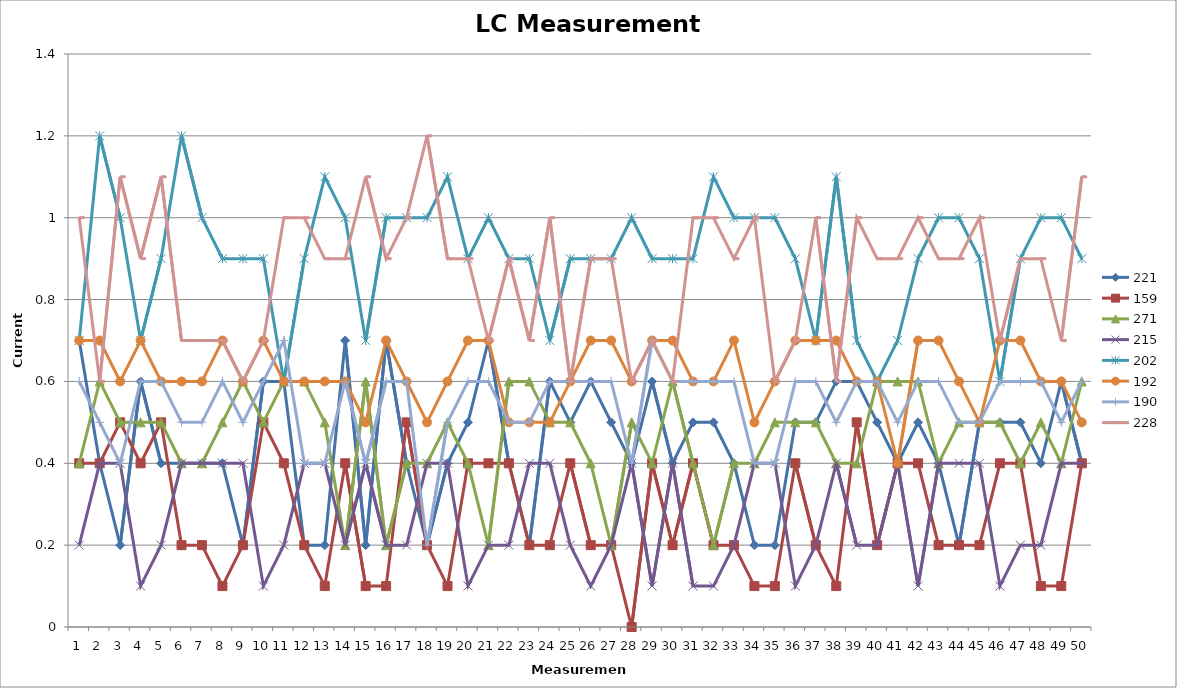
| Category | 221 | 159 | 271 | 215 | 202 | 192 | 190 | 228 |
|---|---|---|---|---|---|---|---|---|
| 0 | 0.7 | 0.4 | 0.4 | 0.2 | 0.7 | 0.7 | 0.6 | 1 |
| 1 | 0.4 | 0.4 | 0.6 | 0.4 | 1.2 | 0.7 | 0.5 | 0.6 |
| 2 | 0.2 | 0.5 | 0.5 | 0.4 | 1 | 0.6 | 0.4 | 1.1 |
| 3 | 0.6 | 0.4 | 0.5 | 0.1 | 0.7 | 0.7 | 0.6 | 0.9 |
| 4 | 0.4 | 0.5 | 0.5 | 0.2 | 0.9 | 0.6 | 0.6 | 1.1 |
| 5 | 0.4 | 0.2 | 0.4 | 0.4 | 1.2 | 0.6 | 0.5 | 0.7 |
| 6 | 0.4 | 0.2 | 0.4 | 0.4 | 1 | 0.6 | 0.5 | 0.7 |
| 7 | 0.4 | 0.1 | 0.5 | 0.4 | 0.9 | 0.7 | 0.6 | 0.7 |
| 8 | 0.2 | 0.2 | 0.6 | 0.4 | 0.9 | 0.6 | 0.5 | 0.6 |
| 9 | 0.6 | 0.5 | 0.5 | 0.1 | 0.9 | 0.7 | 0.6 | 0.7 |
| 10 | 0.6 | 0.4 | 0.6 | 0.2 | 0.6 | 0.6 | 0.7 | 1 |
| 11 | 0.2 | 0.2 | 0.6 | 0.4 | 0.9 | 0.6 | 0.4 | 1 |
| 12 | 0.2 | 0.1 | 0.5 | 0.4 | 1.1 | 0.6 | 0.4 | 0.9 |
| 13 | 0.7 | 0.4 | 0.2 | 0.2 | 1 | 0.6 | 0.6 | 0.9 |
| 14 | 0.2 | 0.1 | 0.6 | 0.4 | 0.7 | 0.5 | 0.4 | 1.1 |
| 15 | 0.7 | 0.1 | 0.2 | 0.2 | 1 | 0.7 | 0.6 | 0.9 |
| 16 | 0.4 | 0.5 | 0.4 | 0.2 | 1 | 0.6 | 0.6 | 1 |
| 17 | 0.2 | 0.2 | 0.4 | 0.4 | 1 | 0.5 | 0.2 | 1.2 |
| 18 | 0.4 | 0.1 | 0.5 | 0.4 | 1.1 | 0.6 | 0.5 | 0.9 |
| 19 | 0.5 | 0.4 | 0.4 | 0.1 | 0.9 | 0.7 | 0.6 | 0.9 |
| 20 | 0.7 | 0.4 | 0.2 | 0.2 | 1 | 0.7 | 0.6 | 0.7 |
| 21 | 0.4 | 0.4 | 0.6 | 0.2 | 0.9 | 0.5 | 0.5 | 0.9 |
| 22 | 0.2 | 0.2 | 0.6 | 0.4 | 0.9 | 0.5 | 0.5 | 0.7 |
| 23 | 0.6 | 0.2 | 0.5 | 0.4 | 0.7 | 0.5 | 0.6 | 1 |
| 24 | 0.5 | 0.4 | 0.5 | 0.2 | 0.9 | 0.6 | 0.6 | 0.6 |
| 25 | 0.6 | 0.2 | 0.4 | 0.1 | 0.9 | 0.7 | 0.6 | 0.9 |
| 26 | 0.5 | 0.2 | 0.2 | 0.2 | 0.9 | 0.7 | 0.6 | 0.9 |
| 27 | 0.4 | 0 | 0.5 | 0.4 | 1 | 0.6 | 0.4 | 0.6 |
| 28 | 0.6 | 0.4 | 0.4 | 0.1 | 0.9 | 0.7 | 0.7 | 0.7 |
| 29 | 0.4 | 0.2 | 0.6 | 0.4 | 0.9 | 0.7 | 0.6 | 0.6 |
| 30 | 0.5 | 0.4 | 0.4 | 0.1 | 0.9 | 0.6 | 0.6 | 1 |
| 31 | 0.5 | 0.2 | 0.2 | 0.1 | 1.1 | 0.6 | 0.6 | 1 |
| 32 | 0.4 | 0.2 | 0.4 | 0.2 | 1 | 0.7 | 0.6 | 0.9 |
| 33 | 0.2 | 0.1 | 0.4 | 0.4 | 1 | 0.5 | 0.4 | 1 |
| 34 | 0.2 | 0.1 | 0.5 | 0.4 | 1 | 0.6 | 0.4 | 0.6 |
| 35 | 0.5 | 0.4 | 0.5 | 0.1 | 0.9 | 0.7 | 0.6 | 0.7 |
| 36 | 0.5 | 0.2 | 0.5 | 0.2 | 0.7 | 0.7 | 0.6 | 1 |
| 37 | 0.6 | 0.1 | 0.4 | 0.4 | 1.1 | 0.7 | 0.5 | 0.6 |
| 38 | 0.6 | 0.5 | 0.4 | 0.2 | 0.7 | 0.6 | 0.6 | 1 |
| 39 | 0.5 | 0.2 | 0.6 | 0.2 | 0.6 | 0.6 | 0.6 | 0.9 |
| 40 | 0.4 | 0.4 | 0.6 | 0.4 | 0.7 | 0.4 | 0.5 | 0.9 |
| 41 | 0.5 | 0.4 | 0.6 | 0.1 | 0.9 | 0.7 | 0.6 | 1 |
| 42 | 0.4 | 0.2 | 0.4 | 0.4 | 1 | 0.7 | 0.6 | 0.9 |
| 43 | 0.2 | 0.2 | 0.5 | 0.4 | 1 | 0.6 | 0.5 | 0.9 |
| 44 | 0.5 | 0.2 | 0.5 | 0.4 | 0.9 | 0.5 | 0.5 | 1 |
| 45 | 0.5 | 0.4 | 0.5 | 0.1 | 0.6 | 0.7 | 0.6 | 0.7 |
| 46 | 0.5 | 0.4 | 0.4 | 0.2 | 0.9 | 0.7 | 0.6 | 0.9 |
| 47 | 0.4 | 0.1 | 0.5 | 0.2 | 1 | 0.6 | 0.6 | 0.9 |
| 48 | 0.6 | 0.1 | 0.4 | 0.4 | 1 | 0.6 | 0.5 | 0.7 |
| 49 | 0.4 | 0.4 | 0.6 | 0.4 | 0.9 | 0.5 | 0.6 | 1.1 |